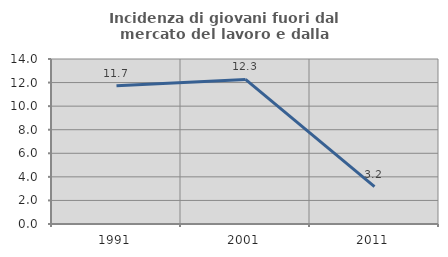
| Category | Incidenza di giovani fuori dal mercato del lavoro e dalla formazione  |
|---|---|
| 1991.0 | 11.724 |
| 2001.0 | 12.264 |
| 2011.0 | 3.175 |